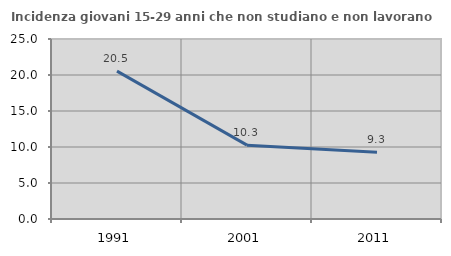
| Category | Incidenza giovani 15-29 anni che non studiano e non lavorano  |
|---|---|
| 1991.0 | 20.545 |
| 2001.0 | 10.256 |
| 2011.0 | 9.259 |